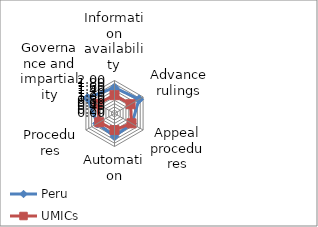
| Category | Peru | UMICs |
|---|---|---|
| Information availability | 1.571 | 1.111 |
| Advance rulings | 1.714 | 1.125 |
| Appeal procedures | 1.222 | 1.19 |
| Automation | 1.385 | 1.005 |
| Procedures | 1.207 | 1.065 |
| Governance and impartiality | 1.889 | 1.178 |